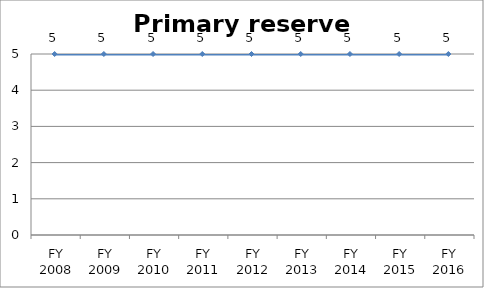
| Category | Primary reserve score |
|---|---|
| FY 2016 | 5 |
| FY 2015 | 5 |
| FY 2014 | 5 |
| FY 2013 | 5 |
| FY 2012 | 5 |
| FY 2011 | 5 |
| FY 2010 | 5 |
| FY 2009 | 5 |
| FY 2008 | 5 |